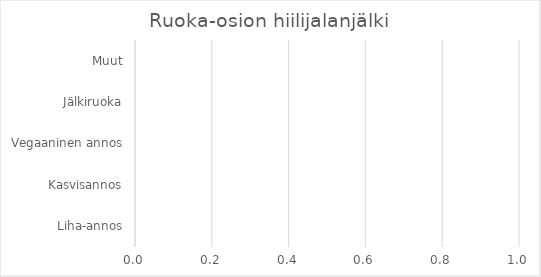
| Category | Infra-osion hiilijalanjälki, Energia |
|---|---|
| Sähkö | 0 |
| Lämmitys | 0 |
| Jäähdytys | 0 |